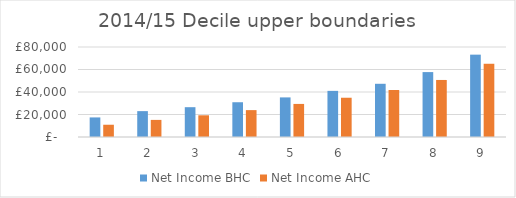
| Category | Net Income BHC | Net Income AHC |
|---|---|---|
| 0 | 17400 | 10900 |
| 1 | 23000 | 15200 |
| 2 | 26500 | 19300 |
| 3 | 30900 | 23900 |
| 4 | 35200 | 29400 |
| 5 | 41000 | 34900 |
| 6 | 47300 | 41800 |
| 7 | 57700 | 50700 |
| 8 | 73200 | 65100 |